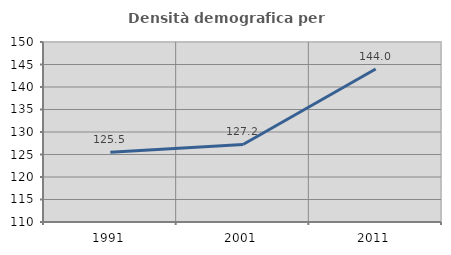
| Category | Densità demografica |
|---|---|
| 1991.0 | 125.513 |
| 2001.0 | 127.232 |
| 2011.0 | 143.996 |